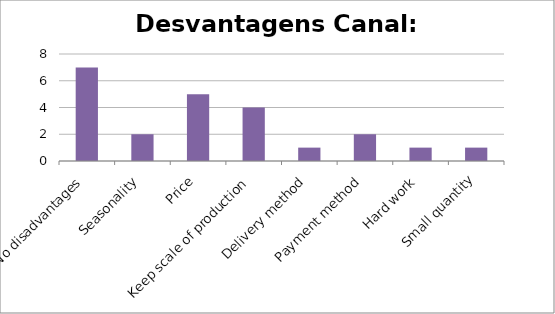
| Category | Series 0 |
|---|---|
| No disadvantages | 7 |
| Seasonality | 2 |
| Price | 5 |
| Keep scale of production | 4 |
| Delivery method | 1 |
| Payment method | 2 |
| Hard work | 1 |
| Small quantity | 1 |